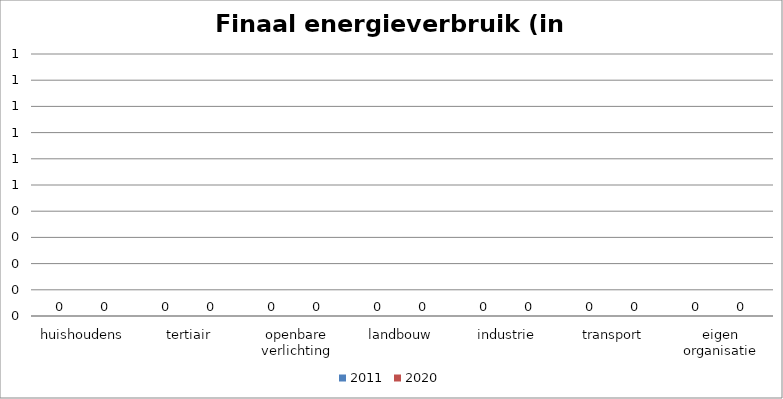
| Category | 2011 | 2020 |
|---|---|---|
| huishoudens | 0 | 0 |
| tertiair | 0 | 0 |
| openbare verlichting | 0 | 0 |
| landbouw | 0 | 0 |
| industrie | 0 | 0 |
| transport | 0 | 0 |
| eigen organisatie | 0 | 0 |